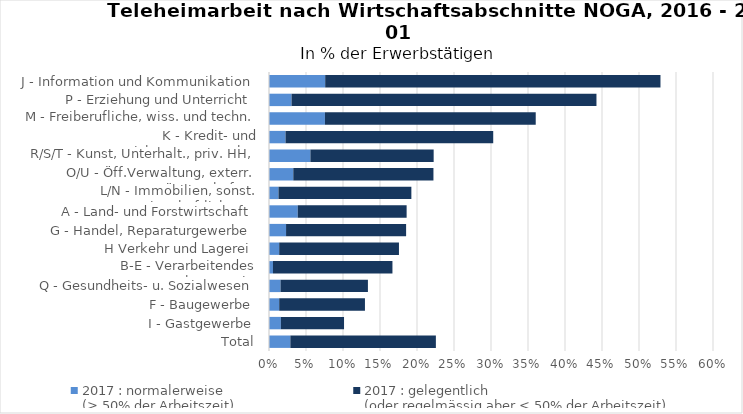
| Category | 2017 : normalerweise  
(> 50% der Arbeitszeit) | 2017 : gelegentlich
(oder regelmässig aber < 50% der Arbeitszeit) |
|---|---|---|
| Total | 0.029 | 0.197 |
| I - Gastgewerbe | 0.016 | 0.085 |
| F - Baugewerbe | 0.014 | 0.116 |
| Q - Gesundheits- u. Sozialwesen | 0.016 | 0.118 |
| B-E - Verarbeitendes Gewerbe/Energie | 0.005 | 0.161 |
| H Verkehr und Lagerei | 0.014 | 0.162 |
| G - Handel, Reparaturgewerbe | 0.023 | 0.162 |
| A - Land- und Forstwirtschaft | 0.039 | 0.147 |
| L/N - Immobilien, sonst. wirtschaftliche DL | 0.013 | 0.18 |
| O/U - Öff.Verwaltung, exterr. Körperschaften | 0.033 | 0.189 |
| R/S/T - Kunst, Unterhalt., priv. HH, sonst. DL | 0.056 | 0.167 |
| K - Kredit- und Versicherungsgewerbe | 0.022 | 0.281 |
| M - Freiberufliche, wiss. und techn. DL | 0.076 | 0.285 |
| P - Erziehung und Unterricht | 0.03 | 0.412 |
| J - Information und Kommunikation | 0.076 | 0.453 |